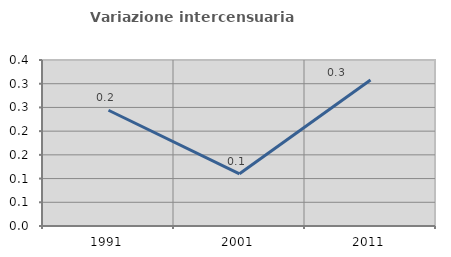
| Category | Variazione intercensuaria annua |
|---|---|
| 1991.0 | 0.244 |
| 2001.0 | 0.11 |
| 2011.0 | 0.308 |